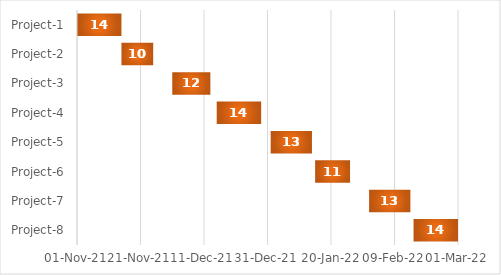
| Category | Start Date | Duration |
|---|---|---|
| Project-1 | 11/1/21 | 14 |
| Project-2 | 11/15/21 | 10 |
| Project-3 | 12/1/21 | 12 |
| Project-4 | 12/15/21 | 14 |
| Project-5 | 1/1/22 | 13 |
| Project-6 | 1/15/22 | 11 |
| Project-7 | 2/1/22 | 13 |
| Project-8 | 2/15/22 | 14 |